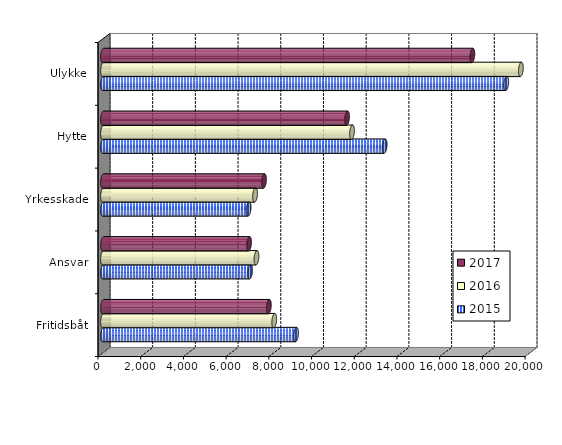
| Category | 2015 | 2016 | 2017 |
|---|---|---|---|
| Fritidsbåt | 9041.093 | 8019.147 | 7766.511 |
| Ansvar | 6888.693 | 7187.708 | 6841.355 |
| Yrkesskade | 6819 | 7122 | 7540.208 |
| Hytte | 13189.706 | 11662.406 | 11429.067 |
| Ulykke | 18883.285 | 19570.411 | 17297.799 |